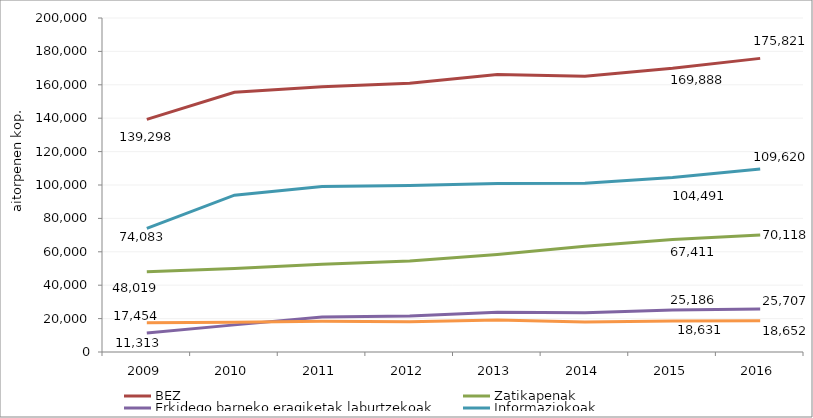
| Category | BEZ | Zatikapenak | Erkidego barneko eragiketak laburtzekoak | Informaziokoak | Sozietateak  |
|---|---|---|---|---|---|
| 2009.0 | 139298 | 48019 | 11313 | 74083 | 17454 |
| 2010.0 | 155555 | 49976 | 16241 | 93924 | 17852 |
| 2011.0 | 158799 | 52600 | 20904 | 99132 | 18416 |
| 2012.0 | 160883 | 54438 | 21534 | 99711 | 18042 |
| 2013.0 | 166124 | 58345 | 23760 | 100895 | 19090 |
| 2014.0 | 165166 | 63305 | 23561 | 101111 | 18005 |
| 2015.0 | 169888 | 67411 | 25186 | 104491 | 18631 |
| 2016.0 | 175821 | 70118 | 25707 | 109620 | 18652 |